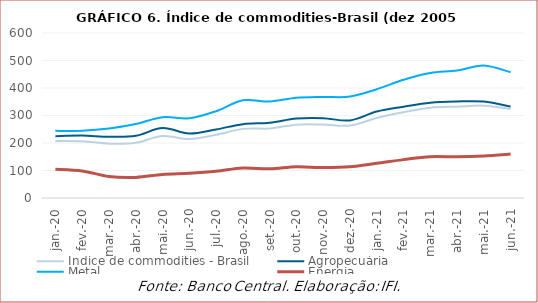
| Category | Índice de commodities - Brasil | Agropecuária | Metal | Energia |
|---|---|---|---|---|
| 2020-01-01 | 207.56 | 224.73 | 244.1 | 104.95 |
| 2020-02-01 | 206.62 | 226.97 | 244.69 | 98.43 |
| 2020-03-01 | 197.72 | 222.98 | 252.59 | 78.1 |
| 2020-04-01 | 200.81 | 226.36 | 268.85 | 74.99 |
| 2020-05-01 | 225.52 | 254.25 | 294 | 85.56 |
| 2020-06-01 | 214.57 | 234.64 | 289.79 | 89.74 |
| 2020-07-01 | 229.77 | 249.4 | 315.48 | 97.08 |
| 2020-08-01 | 251.34 | 268.54 | 355.27 | 109.12 |
| 2020-09-01 | 252.69 | 273.79 | 350.69 | 106.04 |
| 2020-10-01 | 266.69 | 289.01 | 364.31 | 113.71 |
| 2020-11-01 | 267 | 290.4 | 367.6 | 110.59 |
| 2020-12-01 | 263.38 | 282.23 | 368.73 | 113.29 |
| 2021-01-01 | 291.18 | 314.23 | 395.29 | 126.03 |
| 2021-02-01 | 311.65 | 331.74 | 429.96 | 139.53 |
| 2021-03-01 | 328.22 | 346.53 | 454.64 | 150.32 |
| 2021-04-01 | 332.2 | 350.9 | 463.45 | 149.86 |
| 2021-05-01 | 335.87 | 350.52 | 481.68 | 153.11 |
| 2021-06-01 | 323.94 | 332.49 | 457.52 | 159.75 |